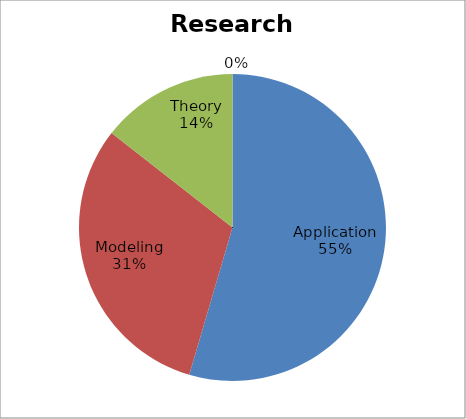
| Category | Research Contribution |
|---|---|
| Application | 102 |
| Modeling | 58 |
| Theory | 27 |